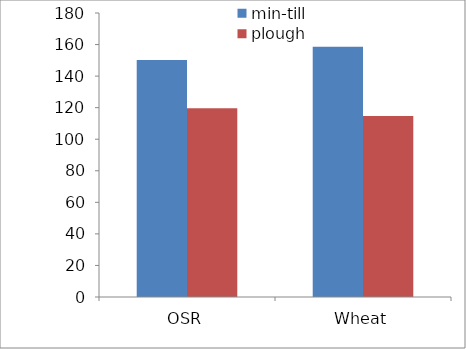
| Category | min-till | plough |
|---|---|---|
| OSR | 150.2 | 119.7 |
| Wheat | 158.6 | 114.7 |